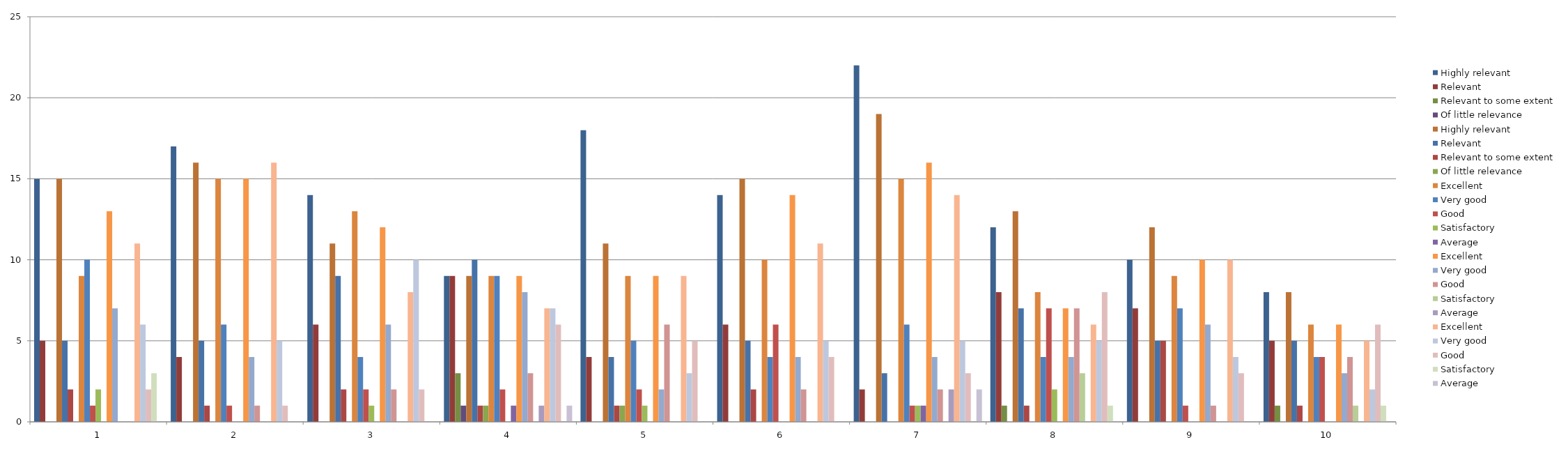
| Category | Highly relevant  | Relevant | Relevant to some extent | Of little relevance | Excellent | Very good | Good | Satisfactory | Average |
|---|---|---|---|---|---|---|---|---|---|
| 0 | 15 | 5 | 2 | 0 | 11 | 6 | 2 | 3 | 0 |
| 1 | 16 | 5 | 1 | 0 | 16 | 5 | 1 | 0 | 0 |
| 2 | 11 | 9 | 2 | 0 | 8 | 10 | 2 | 0 | 0 |
| 3 | 9 | 10 | 1 | 1 | 7 | 7 | 6 | 0 | 1 |
| 4 | 11 | 4 | 1 | 1 | 9 | 3 | 5 | 0 | 0 |
| 5 | 15 | 5 | 2 | 0 | 11 | 5 | 4 | 0 | 0 |
| 6 | 19 | 3 | 0 | 0 | 14 | 5 | 3 | 0 | 2 |
| 7 | 13 | 7 | 1 | 0 | 6 | 5 | 8 | 1 | 0 |
| 8 | 12 | 5 | 5 | 0 | 10 | 4 | 3 | 0 | 0 |
| 9 | 8 | 5 | 1 | 0 | 5 | 2 | 6 | 1 | 0 |